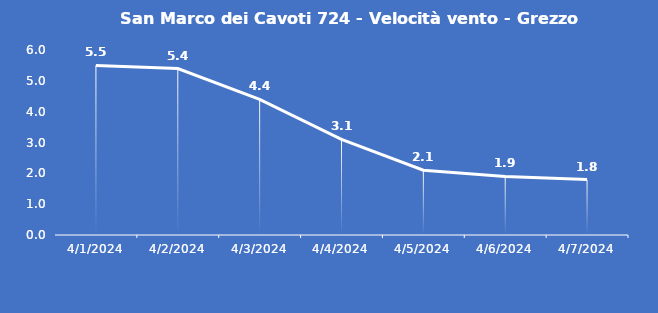
| Category | San Marco dei Cavoti 724 - Velocità vento - Grezzo (m/s) |
|---|---|
| 4/1/24 | 5.5 |
| 4/2/24 | 5.4 |
| 4/3/24 | 4.4 |
| 4/4/24 | 3.1 |
| 4/5/24 | 2.1 |
| 4/6/24 | 1.9 |
| 4/7/24 | 1.8 |